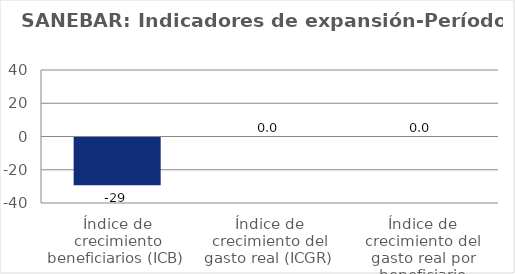
| Category | Series 0 |
|---|---|
| Índice de crecimiento beneficiarios (ICB)  | -28.76 |
| Índice de crecimiento del gasto real (ICGR)  | 0 |
| Índice de crecimiento del gasto real por beneficiario (ICGRB)  | 0 |